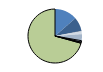
| Category | Series 0 |
|---|---|
| ARRASTRE | 108 |
| CERCO | 66 |
| ATUNEROS CAÑEROS | 2 |
| PALANGRE DE FONDO | 14 |
| PALANGRE DE SUPERFICIE | 31 |
| RASCO | 0 |
| VOLANTA | 7 |
| ARTES FIJAS | 5 |
| ARTES MENORES | 562 |